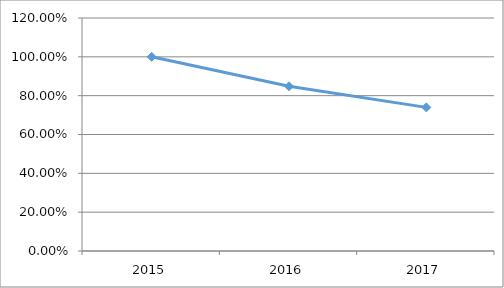
| Category | SEDI-D5O10 |
|---|---|
| 2015.0 | 1 |
| 2016.0 | 0.848 |
| 2017.0 | 0.74 |